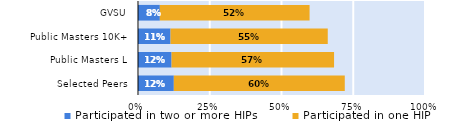
| Category | Participated in two or more HIPs | Participated in one HIP |
|---|---|---|
| Selected Peers | 0.125 | 0.596 |
| Public Masters L | 0.117 | 0.566 |
| Public Masters 10K+ | 0.113 | 0.548 |
| GVSU | 0.076 | 0.522 |